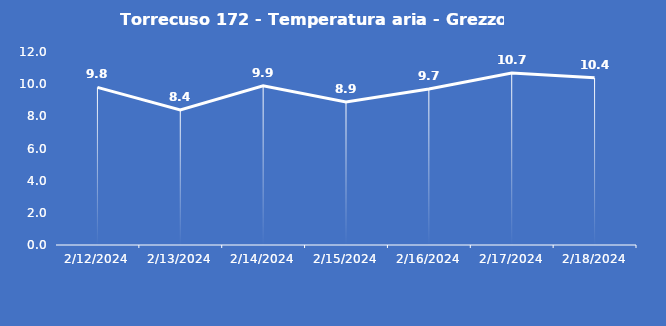
| Category | Torrecuso 172 - Temperatura aria - Grezzo (°C) |
|---|---|
| 2/12/24 | 9.8 |
| 2/13/24 | 8.4 |
| 2/14/24 | 9.9 |
| 2/15/24 | 8.9 |
| 2/16/24 | 9.7 |
| 2/17/24 | 10.7 |
| 2/18/24 | 10.4 |